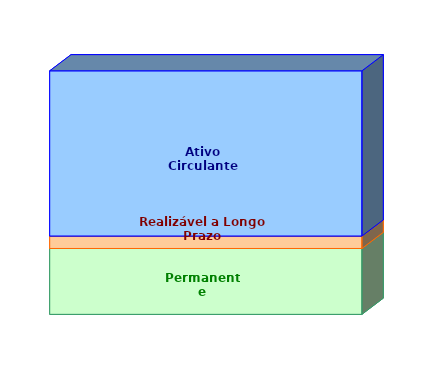
| Category | Permanente | Realizável a Longo Prazo | Ativo Circulante |
|---|---|---|---|
| 0 | 0.271 | 0.051 | 0.678 |